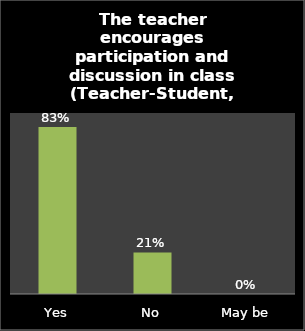
| Category | Series 0 |
|---|---|
| Yes | 0.83 |
| No | 0.207 |
| May be | 0 |